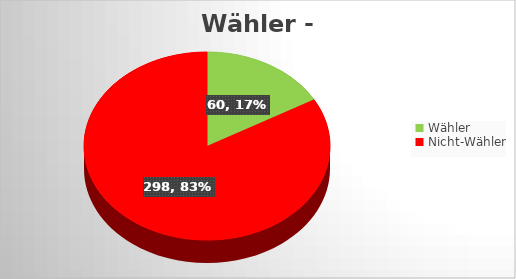
| Category | Series 0 |
|---|---|
| Wähler | 60 |
| Nicht-Wähler | 298 |